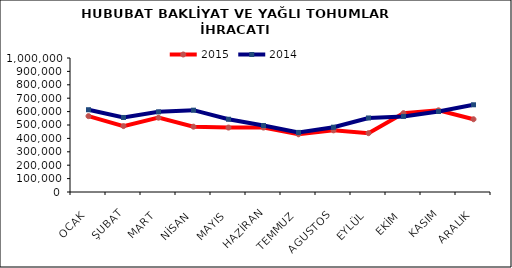
| Category | 2015 | 2014 |
|---|---|---|
| OCAK | 566120.811 | 614049.99 |
| ŞUBAT | 491881.254 | 556283.597 |
| MART | 554740.764 | 598289.294 |
| NİSAN | 487514.103 | 610593.216 |
| MAYIS | 480848.67 | 542860.688 |
| HAZİRAN | 480882.241 | 495849.454 |
| TEMMUZ | 430690.724 | 444810.284 |
| AGUSTOS | 460116.024 | 483524.134 |
| EYLÜL | 438902.138 | 552495.898 |
| EKİM | 588283.306 | 564232.834 |
| KASIM | 609495.033 | 600901.87 |
| ARALIK | 542892.538 | 650912.278 |